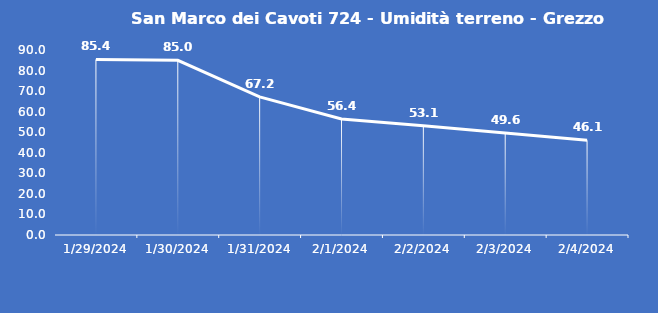
| Category | San Marco dei Cavoti 724 - Umidità terreno - Grezzo (%VWC) |
|---|---|
| 1/29/24 | 85.4 |
| 1/30/24 | 85 |
| 1/31/24 | 67.2 |
| 2/1/24 | 56.4 |
| 2/2/24 | 53.1 |
| 2/3/24 | 49.6 |
| 2/4/24 | 46.1 |